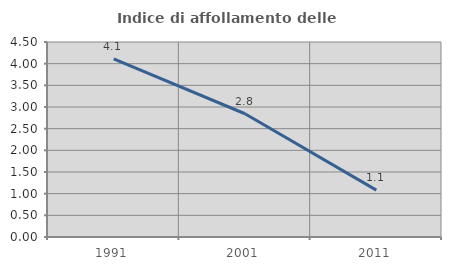
| Category | Indice di affollamento delle abitazioni  |
|---|---|
| 1991.0 | 4.113 |
| 2001.0 | 2.844 |
| 2011.0 | 1.083 |